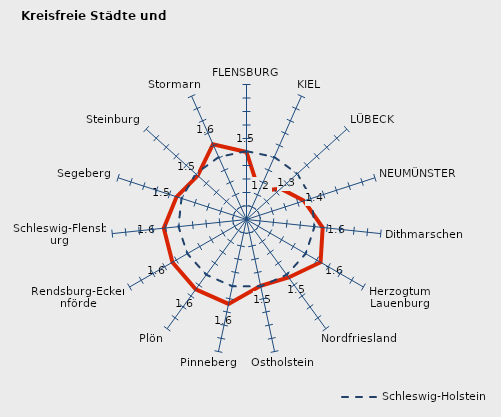
| Category | Kreise | Schleswig-Holstein |
|---|---|---|
| FLENSBURG | 1.5 | 1.506 |
| KIEL | 1.23 | 1.506 |
| LÜBECK | 1.342 | 1.506 |
| NEUMÜNSTER | 1.448 | 1.506 |
| Dithmarschen | 1.567 | 1.506 |
| Herzogtum Lauenburg | 1.634 | 1.506 |
| Nordfriesland | 1.531 | 1.506 |
| Ostholstein | 1.503 | 1.506 |
| Pinneberg | 1.639 | 1.506 |
| Plön | 1.64 | 1.506 |
| Rendsburg-Eckernförde | 1.634 | 1.506 |
| Schleswig-Flensburg | 1.616 | 1.506 |
| Segeberg | 1.544 | 1.506 |
| Steinburg | 1.486 | 1.506 |
| Stormarn | 1.611 | 1.506 |